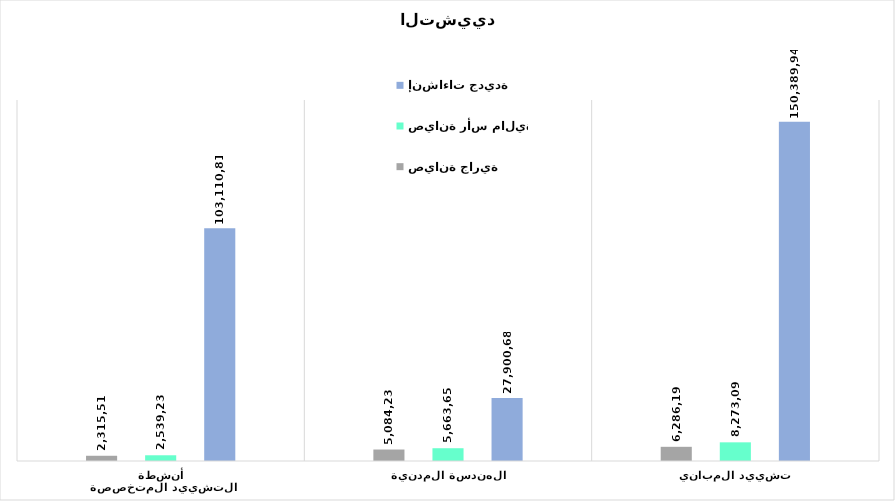
| Category | إنشاءات جديدة    | صيانة رأس مالية | صيانة جارية   |
|---|---|---|---|
| تشييد المباني | 150389942.081 | 8273097.022 | 6286199.272 |
| الهندسة المدنية | 27900688.801 | 5663656.153 | 5084234.053 |
| أنشطة التشييد المتخصصة | 103110811.338 | 2539230.853 | 2315509.713 |